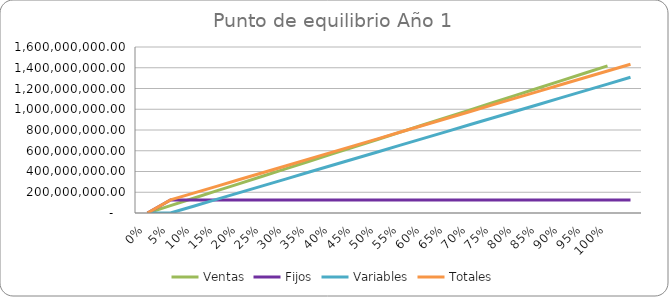
| Category | Ventas | Fijos | Variables | Totales |
|---|---|---|---|---|
| 0.0 | 0 | 0 | 0 | 0 |
| 0.05 | 70875000 | 126343830.987 | 0 | 126343830.987 |
| 0.1 | 141750000 | 126343830.987 | 65393254.222 | 191737085.209 |
| 0.15 | 212625000 | 126343830.987 | 130786508.444 | 257130339.431 |
| 0.2 | 283500000 | 126343830.987 | 196179762.666 | 322523593.653 |
| 0.25 | 354375000 | 126343830.987 | 261573016.889 | 387916847.875 |
| 0.3 | 425250000 | 126343830.987 | 326966271.111 | 453310102.097 |
| 0.35 | 496125000 | 126343830.987 | 392359525.333 | 518703356.319 |
| 0.4 | 567000000 | 126343830.987 | 457752779.555 | 584096610.542 |
| 0.45 | 637875000 | 126343830.987 | 523146033.777 | 649489864.764 |
| 0.5 | 708750000 | 126343830.987 | 588539287.999 | 714883118.986 |
| 0.55 | 779625000 | 126343830.987 | 653932542.221 | 780276373.208 |
| 0.6 | 850500000 | 126343830.987 | 719325796.444 | 845669627.43 |
| 0.65 | 921375000 | 126343830.987 | 784719050.666 | 911062881.652 |
| 0.7 | 992250000 | 126343830.987 | 850112304.888 | 976456135.874 |
| 0.75 | 1063125000 | 126343830.987 | 915505559.11 | 1041849390.097 |
| 0.8 | 1134000000 | 126343830.987 | 980898813.332 | 1107242644.319 |
| 0.85 | 1204875000 | 126343830.987 | 1046292067.554 | 1172635898.541 |
| 0.9 | 1275750000 | 126343830.987 | 1111685321.776 | 1238029152.763 |
| 0.95 | 1346625000 | 126343830.987 | 1177078575.999 | 1303422406.985 |
| 1.0 | 1417500000 | 126343830.987 | 1242471830.221 | 1368815661.207 |